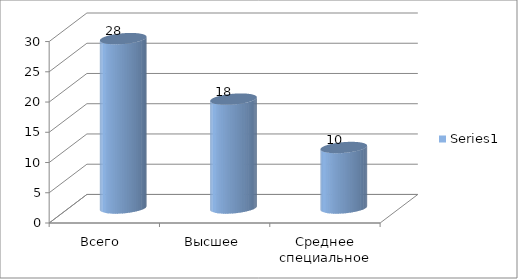
| Category | Series 0 |
|---|---|
| Всего  | 28 |
| Высшее | 18 |
| Среднее специальное | 10 |